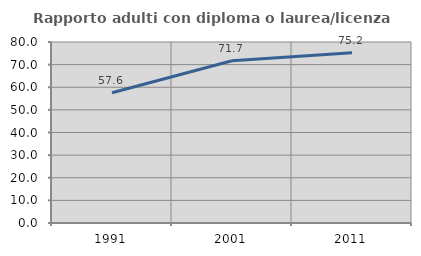
| Category | Rapporto adulti con diploma o laurea/licenza media  |
|---|---|
| 1991.0 | 57.576 |
| 2001.0 | 71.707 |
| 2011.0 | 75.213 |